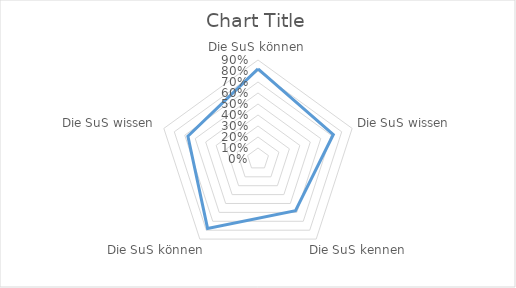
| Category | Series 0 |
|---|---|
| 0 | 0.82 |
| 1 | 0.72 |
| 2 | 0.58 |
| 3 | 0.78 |
| 4 | 0.67 |